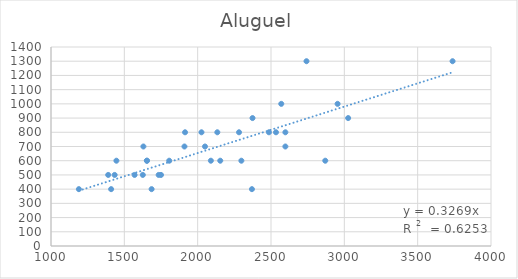
| Category | Aluguel |
|---|---|
| 2870.0 | 600 |
| 1570.0 | 500 |
| 2374.0 | 900 |
| 2026.0 | 800 |
| 1410.0 | 400 |
| 2598.0 | 700 |
| 2370.0 | 400 |
| 1910.0 | 700 |
| 3738.0 | 1300 |
| 2570.0 | 1000 |
| 1654.0 | 600 |
| 1630.0 | 700 |
| 1626.0 | 500 |
| 1390.0 | 500 |
| 2298.0 | 600 |
| 1190.0 | 400 |
| 2742.0 | 1300 |
| 2486.0 | 800 |
| 1446.0 | 600 |
| 2534.0 | 800 |
| 2090.0 | 600 |
| 1806.0 | 600 |
| 1654.0 | 600 |
| 2050.0 | 700 |
| 2134.0 | 800 |
| 1434.0 | 500 |
| 1914.0 | 800 |
| 1734.0 | 500 |
| 2282.0 | 800 |
| 2954.0 | 1000 |
| 1686.0 | 400 |
| 2598.0 | 800 |
| 1750.0 | 500 |
| 3026.0 | 900 |
| 2154.0 | 600 |